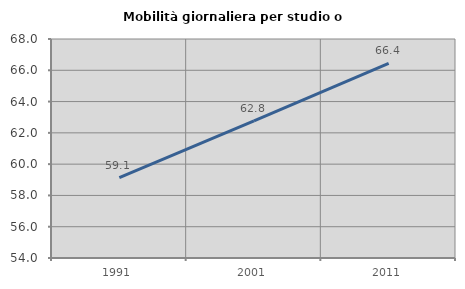
| Category | Mobilità giornaliera per studio o lavoro |
|---|---|
| 1991.0 | 59.131 |
| 2001.0 | 62.764 |
| 2011.0 | 66.448 |